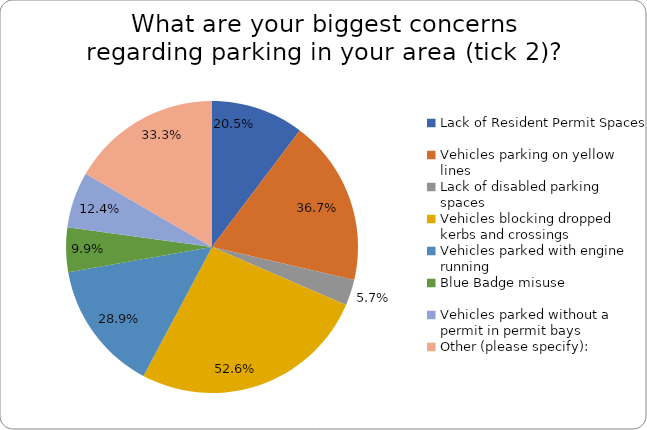
| Category | Series 0 |
|---|---|
| Lack of Resident Permit Spaces | 0.205 |
| Vehicles parking on yellow lines | 0.367 |
| Lack of disabled parking spaces | 0.057 |
| Vehicles blocking dropped kerbs and crossings | 0.526 |
| Vehicles parked with engine running | 0.289 |
| Blue Badge misuse | 0.099 |
| Vehicles parked without a permit in permit bays | 0.124 |
| Other (please specify): | 0.333 |